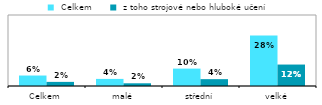
| Category |  Celkem |  z toho strojové nebo hluboké učení |
|---|---|---|
| Celkem | 0.059 | 0.023 |
| malé | 0.04 | 0.015 |
| střední | 0.098 | 0.039 |
| velké | 0.284 | 0.121 |